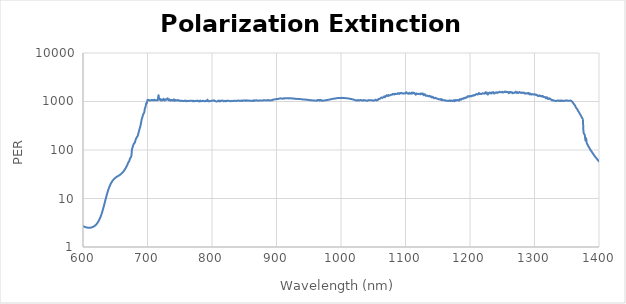
| Category | Series 0 |
|---|---|
| 2500.0 | 1.024 |
| 2499.0 | 1.025 |
| 2498.0 | 1.025 |
| 2497.0 | 1.025 |
| 2496.0 | 1.026 |
| 2495.0 | 1.027 |
| 2494.0 | 1.027 |
| 2493.0 | 1.027 |
| 2492.0 | 1.027 |
| 2491.0 | 1.028 |
| 2490.0 | 1.028 |
| 2489.0 | 1.028 |
| 2488.0 | 1.029 |
| 2487.0 | 1.029 |
| 2486.0 | 1.029 |
| 2485.0 | 1.029 |
| 2484.0 | 1.03 |
| 2483.0 | 1.03 |
| 2482.0 | 1.031 |
| 2481.0 | 1.031 |
| 2480.0 | 1.031 |
| 2479.0 | 1.032 |
| 2478.0 | 1.032 |
| 2477.0 | 1.032 |
| 2476.0 | 1.033 |
| 2475.0 | 1.033 |
| 2474.0 | 1.034 |
| 2473.0 | 1.034 |
| 2472.0 | 1.035 |
| 2471.0 | 1.035 |
| 2470.0 | 1.035 |
| 2469.0 | 1.035 |
| 2468.0 | 1.035 |
| 2467.0 | 1.036 |
| 2466.0 | 1.036 |
| 2465.0 | 1.037 |
| 2464.0 | 1.037 |
| 2463.0 | 1.037 |
| 2462.0 | 1.038 |
| 2461.0 | 1.038 |
| 2460.0 | 1.038 |
| 2459.0 | 1.039 |
| 2458.0 | 1.039 |
| 2457.0 | 1.04 |
| 2456.0 | 1.04 |
| 2455.0 | 1.041 |
| 2454.0 | 1.041 |
| 2453.0 | 1.041 |
| 2452.0 | 1.042 |
| 2451.0 | 1.042 |
| 2450.0 | 1.042 |
| 2449.0 | 1.043 |
| 2448.0 | 1.043 |
| 2447.0 | 1.043 |
| 2446.0 | 1.044 |
| 2445.0 | 1.044 |
| 2444.0 | 1.045 |
| 2443.0 | 1.045 |
| 2442.0 | 1.045 |
| 2441.0 | 1.046 |
| 2440.0 | 1.046 |
| 2439.0 | 1.046 |
| 2438.0 | 1.047 |
| 2437.0 | 1.047 |
| 2436.0 | 1.048 |
| 2435.0 | 1.048 |
| 2434.0 | 1.048 |
| 2433.0 | 1.048 |
| 2432.0 | 1.049 |
| 2431.0 | 1.049 |
| 2430.0 | 1.049 |
| 2429.0 | 1.049 |
| 2428.0 | 1.05 |
| 2427.0 | 1.05 |
| 2426.0 | 1.051 |
| 2425.0 | 1.051 |
| 2424.0 | 1.051 |
| 2423.0 | 1.051 |
| 2422.0 | 1.051 |
| 2421.0 | 1.052 |
| 2420.0 | 1.053 |
| 2419.0 | 1.052 |
| 2418.0 | 1.053 |
| 2417.0 | 1.053 |
| 2416.0 | 1.053 |
| 2415.0 | 1.053 |
| 2414.0 | 1.054 |
| 2413.0 | 1.054 |
| 2412.0 | 1.054 |
| 2411.0 | 1.054 |
| 2410.0 | 1.054 |
| 2409.0 | 1.055 |
| 2408.0 | 1.055 |
| 2407.0 | 1.055 |
| 2406.0 | 1.056 |
| 2405.0 | 1.055 |
| 2404.0 | 1.056 |
| 2403.0 | 1.056 |
| 2402.0 | 1.056 |
| 2401.0 | 1.056 |
| 2400.0 | 1.057 |
| 2399.0 | 1.057 |
| 2398.0 | 1.057 |
| 2397.0 | 1.058 |
| 2396.0 | 1.058 |
| 2395.0 | 1.057 |
| 2394.0 | 1.058 |
| 2393.0 | 1.057 |
| 2392.0 | 1.058 |
| 2391.0 | 1.058 |
| 2390.0 | 1.058 |
| 2389.0 | 1.058 |
| 2388.0 | 1.058 |
| 2387.0 | 1.058 |
| 2386.0 | 1.059 |
| 2385.0 | 1.059 |
| 2384.0 | 1.06 |
| 2383.0 | 1.059 |
| 2382.0 | 1.059 |
| 2381.0 | 1.059 |
| 2380.0 | 1.059 |
| 2379.0 | 1.06 |
| 2378.0 | 1.059 |
| 2377.0 | 1.06 |
| 2376.0 | 1.059 |
| 2375.0 | 1.059 |
| 2374.0 | 1.059 |
| 2373.0 | 1.06 |
| 2372.0 | 1.059 |
| 2371.0 | 1.06 |
| 2370.0 | 1.059 |
| 2369.0 | 1.06 |
| 2368.0 | 1.06 |
| 2367.0 | 1.06 |
| 2366.0 | 1.059 |
| 2365.0 | 1.06 |
| 2364.0 | 1.06 |
| 2363.0 | 1.06 |
| 2362.0 | 1.06 |
| 2361.0 | 1.06 |
| 2360.0 | 1.06 |
| 2359.0 | 1.06 |
| 2358.0 | 1.06 |
| 2357.0 | 1.06 |
| 2356.0 | 1.06 |
| 2355.0 | 1.059 |
| 2354.0 | 1.06 |
| 2353.0 | 1.059 |
| 2352.0 | 1.06 |
| 2351.0 | 1.06 |
| 2350.0 | 1.059 |
| 2349.0 | 1.06 |
| 2348.0 | 1.059 |
| 2347.0 | 1.059 |
| 2346.0 | 1.059 |
| 2345.0 | 1.059 |
| 2344.0 | 1.059 |
| 2343.0 | 1.06 |
| 2342.0 | 1.059 |
| 2341.0 | 1.059 |
| 2340.0 | 1.059 |
| 2339.0 | 1.059 |
| 2338.0 | 1.059 |
| 2337.0 | 1.059 |
| 2336.0 | 1.059 |
| 2335.0 | 1.059 |
| 2334.0 | 1.059 |
| 2333.0 | 1.059 |
| 2332.0 | 1.059 |
| 2331.0 | 1.059 |
| 2330.0 | 1.058 |
| 2329.0 | 1.059 |
| 2328.0 | 1.058 |
| 2327.0 | 1.058 |
| 2326.0 | 1.058 |
| 2325.0 | 1.058 |
| 2324.0 | 1.058 |
| 2323.0 | 1.058 |
| 2322.0 | 1.058 |
| 2321.0 | 1.058 |
| 2320.0 | 1.058 |
| 2319.0 | 1.058 |
| 2318.0 | 1.057 |
| 2317.0 | 1.058 |
| 2316.0 | 1.058 |
| 2315.0 | 1.058 |
| 2314.0 | 1.058 |
| 2313.0 | 1.058 |
| 2312.0 | 1.058 |
| 2311.0 | 1.058 |
| 2310.0 | 1.058 |
| 2309.0 | 1.058 |
| 2308.0 | 1.058 |
| 2307.0 | 1.058 |
| 2306.0 | 1.058 |
| 2305.0 | 1.058 |
| 2304.0 | 1.058 |
| 2303.0 | 1.058 |
| 2302.0 | 1.058 |
| 2301.0 | 1.058 |
| 2300.0 | 1.058 |
| 2299.0 | 1.058 |
| 2298.0 | 1.058 |
| 2297.0 | 1.058 |
| 2296.0 | 1.057 |
| 2295.0 | 1.057 |
| 2294.0 | 1.057 |
| 2293.0 | 1.057 |
| 2292.0 | 1.057 |
| 2291.0 | 1.057 |
| 2290.0 | 1.056 |
| 2289.0 | 1.057 |
| 2288.0 | 1.056 |
| 2287.0 | 1.056 |
| 2286.0 | 1.056 |
| 2285.0 | 1.056 |
| 2284.0 | 1.055 |
| 2283.0 | 1.055 |
| 2282.0 | 1.055 |
| 2281.0 | 1.055 |
| 2280.0 | 1.055 |
| 2279.0 | 1.055 |
| 2278.0 | 1.055 |
| 2277.0 | 1.055 |
| 2276.0 | 1.056 |
| 2275.0 | 1.056 |
| 2274.0 | 1.056 |
| 2273.0 | 1.057 |
| 2272.0 | 1.057 |
| 2271.0 | 1.058 |
| 2270.0 | 1.058 |
| 2269.0 | 1.059 |
| 2268.0 | 1.059 |
| 2267.0 | 1.06 |
| 2266.0 | 1.061 |
| 2265.0 | 1.061 |
| 2264.0 | 1.062 |
| 2263.0 | 1.062 |
| 2262.0 | 1.063 |
| 2261.0 | 1.064 |
| 2260.0 | 1.064 |
| 2259.0 | 1.065 |
| 2258.0 | 1.065 |
| 2257.0 | 1.065 |
| 2256.0 | 1.066 |
| 2255.0 | 1.067 |
| 2254.0 | 1.067 |
| 2253.0 | 1.068 |
| 2252.0 | 1.068 |
| 2251.0 | 1.069 |
| 2250.0 | 1.069 |
| 2249.0 | 1.07 |
| 2248.0 | 1.07 |
| 2247.0 | 1.071 |
| 2246.0 | 1.071 |
| 2245.0 | 1.071 |
| 2244.0 | 1.072 |
| 2243.0 | 1.072 |
| 2242.0 | 1.073 |
| 2241.0 | 1.073 |
| 2240.0 | 1.074 |
| 2239.0 | 1.074 |
| 2238.0 | 1.075 |
| 2237.0 | 1.075 |
| 2236.0 | 1.076 |
| 2235.0 | 1.076 |
| 2234.0 | 1.077 |
| 2233.0 | 1.078 |
| 2232.0 | 1.078 |
| 2231.0 | 1.079 |
| 2230.0 | 1.08 |
| 2229.0 | 1.081 |
| 2228.0 | 1.082 |
| 2227.0 | 1.082 |
| 2226.0 | 1.083 |
| 2225.0 | 1.084 |
| 2224.0 | 1.085 |
| 2223.0 | 1.086 |
| 2222.0 | 1.087 |
| 2221.0 | 1.088 |
| 2220.0 | 1.089 |
| 2219.0 | 1.09 |
| 2218.0 | 1.091 |
| 2217.0 | 1.092 |
| 2216.0 | 1.093 |
| 2215.0 | 1.094 |
| 2214.0 | 1.095 |
| 2213.0 | 1.096 |
| 2212.0 | 1.097 |
| 2211.0 | 1.098 |
| 2210.0 | 1.1 |
| 2209.0 | 1.101 |
| 2208.0 | 1.102 |
| 2207.0 | 1.103 |
| 2206.0 | 1.104 |
| 2205.0 | 1.105 |
| 2204.0 | 1.107 |
| 2203.0 | 1.108 |
| 2202.0 | 1.11 |
| 2201.0 | 1.111 |
| 2200.0 | 1.112 |
| 2199.0 | 1.114 |
| 2198.0 | 1.115 |
| 2197.0 | 1.116 |
| 2196.0 | 1.118 |
| 2195.0 | 1.12 |
| 2194.0 | 1.121 |
| 2193.0 | 1.122 |
| 2192.0 | 1.124 |
| 2191.0 | 1.126 |
| 2190.0 | 1.127 |
| 2189.0 | 1.129 |
| 2188.0 | 1.131 |
| 2187.0 | 1.132 |
| 2186.0 | 1.134 |
| 2185.0 | 1.136 |
| 2184.0 | 1.138 |
| 2183.0 | 1.14 |
| 2182.0 | 1.142 |
| 2181.0 | 1.144 |
| 2180.0 | 1.146 |
| 2179.0 | 1.148 |
| 2178.0 | 1.151 |
| 2177.0 | 1.153 |
| 2176.0 | 1.156 |
| 2175.0 | 1.158 |
| 2174.0 | 1.16 |
| 2173.0 | 1.162 |
| 2172.0 | 1.165 |
| 2171.0 | 1.167 |
| 2170.0 | 1.17 |
| 2169.0 | 1.172 |
| 2168.0 | 1.175 |
| 2167.0 | 1.177 |
| 2166.0 | 1.18 |
| 2165.0 | 1.182 |
| 2164.0 | 1.185 |
| 2163.0 | 1.187 |
| 2162.0 | 1.19 |
| 2161.0 | 1.193 |
| 2160.0 | 1.195 |
| 2159.0 | 1.198 |
| 2158.0 | 1.201 |
| 2157.0 | 1.203 |
| 2156.0 | 1.206 |
| 2155.0 | 1.209 |
| 2154.0 | 1.212 |
| 2153.0 | 1.215 |
| 2152.0 | 1.218 |
| 2151.0 | 1.22 |
| 2150.0 | 1.222 |
| 2149.0 | 1.226 |
| 2148.0 | 1.229 |
| 2147.0 | 1.231 |
| 2146.0 | 1.234 |
| 2145.0 | 1.238 |
| 2144.0 | 1.24 |
| 2143.0 | 1.244 |
| 2142.0 | 1.247 |
| 2141.0 | 1.249 |
| 2140.0 | 1.252 |
| 2139.0 | 1.255 |
| 2138.0 | 1.258 |
| 2137.0 | 1.261 |
| 2136.0 | 1.264 |
| 2135.0 | 1.267 |
| 2134.0 | 1.27 |
| 2133.0 | 1.274 |
| 2132.0 | 1.276 |
| 2131.0 | 1.278 |
| 2130.0 | 1.283 |
| 2129.0 | 1.286 |
| 2128.0 | 1.289 |
| 2127.0 | 1.291 |
| 2126.0 | 1.295 |
| 2125.0 | 1.298 |
| 2124.0 | 1.299 |
| 2123.0 | 1.303 |
| 2122.0 | 1.307 |
| 2121.0 | 1.309 |
| 2120.0 | 1.313 |
| 2119.0 | 1.316 |
| 2118.0 | 1.318 |
| 2117.0 | 1.322 |
| 2116.0 | 1.325 |
| 2115.0 | 1.327 |
| 2114.0 | 1.33 |
| 2113.0 | 1.333 |
| 2112.0 | 1.336 |
| 2111.0 | 1.339 |
| 2110.0 | 1.342 |
| 2109.0 | 1.345 |
| 2108.0 | 1.347 |
| 2107.0 | 1.35 |
| 2106.0 | 1.352 |
| 2105.0 | 1.356 |
| 2104.0 | 1.359 |
| 2103.0 | 1.36 |
| 2102.0 | 1.364 |
| 2101.0 | 1.367 |
| 2100.0 | 1.368 |
| 2099.0 | 1.371 |
| 2098.0 | 1.374 |
| 2097.0 | 1.377 |
| 2096.0 | 1.378 |
| 2095.0 | 1.38 |
| 2094.0 | 1.383 |
| 2093.0 | 1.384 |
| 2092.0 | 1.387 |
| 2091.0 | 1.39 |
| 2090.0 | 1.391 |
| 2089.0 | 1.393 |
| 2088.0 | 1.396 |
| 2087.0 | 1.398 |
| 2086.0 | 1.399 |
| 2085.0 | 1.402 |
| 2084.0 | 1.402 |
| 2083.0 | 1.405 |
| 2082.0 | 1.407 |
| 2081.0 | 1.408 |
| 2080.0 | 1.408 |
| 2079.0 | 1.412 |
| 2078.0 | 1.413 |
| 2077.0 | 1.413 |
| 2076.0 | 1.415 |
| 2075.0 | 1.416 |
| 2074.0 | 1.417 |
| 2073.0 | 1.418 |
| 2072.0 | 1.42 |
| 2071.0 | 1.421 |
| 2070.0 | 1.421 |
| 2069.0 | 1.422 |
| 2068.0 | 1.422 |
| 2067.0 | 1.423 |
| 2066.0 | 1.424 |
| 2065.0 | 1.424 |
| 2064.0 | 1.425 |
| 2063.0 | 1.425 |
| 2062.0 | 1.424 |
| 2061.0 | 1.426 |
| 2060.0 | 1.425 |
| 2059.0 | 1.424 |
| 2058.0 | 1.425 |
| 2057.0 | 1.424 |
| 2056.0 | 1.424 |
| 2055.0 | 1.424 |
| 2054.0 | 1.423 |
| 2053.0 | 1.423 |
| 2052.0 | 1.423 |
| 2051.0 | 1.422 |
| 2050.0 | 1.421 |
| 2049.0 | 1.42 |
| 2048.0 | 1.419 |
| 2047.0 | 1.418 |
| 2046.0 | 1.417 |
| 2045.0 | 1.416 |
| 2044.0 | 1.414 |
| 2043.0 | 1.413 |
| 2042.0 | 1.412 |
| 2041.0 | 1.41 |
| 2040.0 | 1.409 |
| 2039.0 | 1.407 |
| 2038.0 | 1.406 |
| 2037.0 | 1.403 |
| 2036.0 | 1.401 |
| 2035.0 | 1.399 |
| 2034.0 | 1.398 |
| 2033.0 | 1.394 |
| 2032.0 | 1.392 |
| 2031.0 | 1.39 |
| 2030.0 | 1.388 |
| 2029.0 | 1.386 |
| 2028.0 | 1.383 |
| 2027.0 | 1.381 |
| 2026.0 | 1.377 |
| 2025.0 | 1.375 |
| 2024.0 | 1.372 |
| 2023.0 | 1.369 |
| 2022.0 | 1.366 |
| 2021.0 | 1.363 |
| 2020.0 | 1.36 |
| 2019.0 | 1.357 |
| 2018.0 | 1.353 |
| 2017.0 | 1.35 |
| 2016.0 | 1.347 |
| 2015.0 | 1.344 |
| 2014.0 | 1.341 |
| 2013.0 | 1.335 |
| 2012.0 | 1.334 |
| 2011.0 | 1.329 |
| 2010.0 | 1.326 |
| 2009.0 | 1.322 |
| 2008.0 | 1.317 |
| 2007.0 | 1.314 |
| 2006.0 | 1.311 |
| 2005.0 | 1.306 |
| 2004.0 | 1.303 |
| 2003.0 | 1.298 |
| 2002.0 | 1.294 |
| 2001.0 | 1.291 |
| 2000.0 | 1.286 |
| 1999.0 | 1.271 |
| 1998.0 | 1.267 |
| 1997.0 | 1.262 |
| 1996.0 | 1.258 |
| 1995.0 | 1.254 |
| 1994.0 | 1.249 |
| 1993.0 | 1.245 |
| 1992.0 | 1.24 |
| 1991.0 | 1.236 |
| 1990.0 | 1.232 |
| 1989.0 | 1.227 |
| 1988.0 | 1.223 |
| 1987.0 | 1.218 |
| 1986.0 | 1.214 |
| 1985.0 | 1.21 |
| 1984.0 | 1.205 |
| 1983.0 | 1.201 |
| 1982.0 | 1.196 |
| 1981.0 | 1.192 |
| 1980.0 | 1.187 |
| 1979.0 | 1.183 |
| 1978.0 | 1.178 |
| 1977.0 | 1.175 |
| 1976.0 | 1.169 |
| 1975.0 | 1.165 |
| 1974.0 | 1.162 |
| 1973.0 | 1.156 |
| 1972.0 | 1.153 |
| 1971.0 | 1.149 |
| 1970.0 | 1.145 |
| 1969.0 | 1.141 |
| 1968.0 | 1.137 |
| 1967.0 | 1.133 |
| 1966.0 | 1.129 |
| 1965.0 | 1.125 |
| 1964.0 | 1.121 |
| 1963.0 | 1.117 |
| 1962.0 | 1.114 |
| 1961.0 | 1.11 |
| 1960.0 | 1.107 |
| 1959.0 | 1.103 |
| 1958.0 | 1.1 |
| 1957.0 | 1.097 |
| 1956.0 | 1.093 |
| 1955.0 | 1.09 |
| 1954.0 | 1.087 |
| 1953.0 | 1.083 |
| 1952.0 | 1.082 |
| 1951.0 | 1.078 |
| 1950.0 | 1.075 |
| 1949.0 | 1.073 |
| 1948.0 | 1.069 |
| 1947.0 | 1.067 |
| 1946.0 | 1.065 |
| 1945.0 | 1.063 |
| 1944.0 | 1.06 |
| 1943.0 | 1.058 |
| 1942.0 | 1.056 |
| 1941.0 | 1.054 |
| 1940.0 | 1.052 |
| 1939.0 | 1.051 |
| 1938.0 | 1.049 |
| 1937.0 | 1.048 |
| 1936.0 | 1.046 |
| 1935.0 | 1.045 |
| 1934.0 | 1.044 |
| 1933.0 | 1.043 |
| 1932.0 | 1.042 |
| 1931.0 | 1.041 |
| 1930.0 | 1.04 |
| 1929.0 | 1.04 |
| 1928.0 | 1.039 |
| 1927.0 | 1.039 |
| 1926.0 | 1.038 |
| 1925.0 | 1.038 |
| 1924.0 | 1.038 |
| 1923.0 | 1.037 |
| 1922.0 | 1.038 |
| 1921.0 | 1.039 |
| 1920.0 | 1.039 |
| 1919.0 | 1.039 |
| 1918.0 | 1.04 |
| 1917.0 | 1.04 |
| 1916.0 | 1.041 |
| 1915.0 | 1.042 |
| 1914.0 | 1.043 |
| 1913.0 | 1.044 |
| 1912.0 | 1.045 |
| 1911.0 | 1.046 |
| 1910.0 | 1.051 |
| 1909.0 | 1.049 |
| 1908.0 | 1.051 |
| 1907.0 | 1.052 |
| 1906.0 | 1.054 |
| 1905.0 | 1.056 |
| 1904.0 | 1.058 |
| 1903.0 | 1.061 |
| 1902.0 | 1.063 |
| 1901.0 | 1.064 |
| 1900.0 | 1.068 |
| 1899.0 | 1.07 |
| 1898.0 | 1.073 |
| 1897.0 | 1.076 |
| 1896.0 | 1.078 |
| 1895.0 | 1.081 |
| 1894.0 | 1.084 |
| 1893.0 | 1.087 |
| 1892.0 | 1.09 |
| 1891.0 | 1.093 |
| 1890.0 | 1.096 |
| 1889.0 | 1.099 |
| 1888.0 | 1.102 |
| 1887.0 | 1.106 |
| 1886.0 | 1.109 |
| 1885.0 | 1.113 |
| 1884.0 | 1.116 |
| 1883.0 | 1.12 |
| 1882.0 | 1.123 |
| 1881.0 | 1.127 |
| 1880.0 | 1.131 |
| 1879.0 | 1.134 |
| 1878.0 | 1.138 |
| 1877.0 | 1.142 |
| 1876.0 | 1.146 |
| 1875.0 | 1.15 |
| 1874.0 | 1.155 |
| 1873.0 | 1.159 |
| 1872.0 | 1.164 |
| 1871.0 | 1.17 |
| 1870.0 | 1.174 |
| 1869.0 | 1.18 |
| 1868.0 | 1.185 |
| 1867.0 | 1.189 |
| 1866.0 | 1.194 |
| 1865.0 | 1.199 |
| 1864.0 | 1.204 |
| 1863.0 | 1.208 |
| 1862.0 | 1.213 |
| 1861.0 | 1.217 |
| 1860.0 | 1.222 |
| 1859.0 | 1.227 |
| 1858.0 | 1.232 |
| 1857.0 | 1.237 |
| 1856.0 | 1.242 |
| 1855.0 | 1.247 |
| 1854.0 | 1.252 |
| 1853.0 | 1.257 |
| 1852.0 | 1.263 |
| 1851.0 | 1.267 |
| 1850.0 | 1.273 |
| 1849.0 | 1.278 |
| 1848.0 | 1.285 |
| 1847.0 | 1.288 |
| 1846.0 | 1.293 |
| 1845.0 | 1.298 |
| 1844.0 | 1.303 |
| 1843.0 | 1.308 |
| 1842.0 | 1.313 |
| 1841.0 | 1.318 |
| 1840.0 | 1.323 |
| 1839.0 | 1.328 |
| 1838.0 | 1.333 |
| 1837.0 | 1.338 |
| 1836.0 | 1.343 |
| 1835.0 | 1.346 |
| 1834.0 | 1.353 |
| 1833.0 | 1.357 |
| 1832.0 | 1.361 |
| 1831.0 | 1.366 |
| 1830.0 | 1.37 |
| 1829.0 | 1.374 |
| 1828.0 | 1.378 |
| 1827.0 | 1.382 |
| 1826.0 | 1.386 |
| 1825.0 | 1.39 |
| 1824.0 | 1.393 |
| 1823.0 | 1.397 |
| 1822.0 | 1.4 |
| 1821.0 | 1.403 |
| 1820.0 | 1.406 |
| 1819.0 | 1.409 |
| 1818.0 | 1.412 |
| 1817.0 | 1.415 |
| 1816.0 | 1.418 |
| 1815.0 | 1.42 |
| 1814.0 | 1.422 |
| 1813.0 | 1.424 |
| 1812.0 | 1.426 |
| 1811.0 | 1.428 |
| 1810.0 | 1.43 |
| 1809.0 | 1.431 |
| 1808.0 | 1.432 |
| 1807.0 | 1.433 |
| 1806.0 | 1.434 |
| 1805.0 | 1.435 |
| 1804.0 | 1.436 |
| 1803.0 | 1.436 |
| 1802.0 | 1.437 |
| 1801.0 | 1.437 |
| 1800.0 | 1.437 |
| 1799.0 | 1.436 |
| 1798.0 | 1.436 |
| 1797.0 | 1.436 |
| 1796.0 | 1.436 |
| 1795.0 | 1.435 |
| 1794.0 | 1.434 |
| 1793.0 | 1.434 |
| 1792.0 | 1.432 |
| 1791.0 | 1.432 |
| 1790.0 | 1.43 |
| 1789.0 | 1.429 |
| 1788.0 | 1.428 |
| 1787.0 | 1.426 |
| 1786.0 | 1.424 |
| 1785.0 | 1.423 |
| 1784.0 | 1.421 |
| 1783.0 | 1.419 |
| 1782.0 | 1.417 |
| 1781.0 | 1.415 |
| 1780.0 | 1.413 |
| 1779.0 | 1.411 |
| 1778.0 | 1.409 |
| 1777.0 | 1.407 |
| 1776.0 | 1.404 |
| 1775.0 | 1.402 |
| 1774.0 | 1.4 |
| 1773.0 | 1.397 |
| 1772.0 | 1.395 |
| 1771.0 | 1.393 |
| 1770.0 | 1.39 |
| 1769.0 | 1.388 |
| 1768.0 | 1.386 |
| 1767.0 | 1.384 |
| 1766.0 | 1.382 |
| 1765.0 | 1.38 |
| 1764.0 | 1.377 |
| 1763.0 | 1.375 |
| 1762.0 | 1.374 |
| 1761.0 | 1.372 |
| 1760.0 | 1.369 |
| 1759.0 | 1.368 |
| 1758.0 | 1.367 |
| 1757.0 | 1.366 |
| 1756.0 | 1.363 |
| 1755.0 | 1.362 |
| 1754.0 | 1.362 |
| 1753.0 | 1.361 |
| 1752.0 | 1.359 |
| 1751.0 | 1.359 |
| 1750.0 | 1.359 |
| 1749.0 | 1.358 |
| 1748.0 | 1.357 |
| 1747.0 | 1.358 |
| 1746.0 | 1.358 |
| 1745.0 | 1.357 |
| 1744.0 | 1.358 |
| 1743.0 | 1.359 |
| 1742.0 | 1.359 |
| 1741.0 | 1.36 |
| 1740.0 | 1.361 |
| 1739.0 | 1.363 |
| 1738.0 | 1.364 |
| 1737.0 | 1.366 |
| 1736.0 | 1.368 |
| 1735.0 | 1.37 |
| 1734.0 | 1.372 |
| 1733.0 | 1.376 |
| 1732.0 | 1.377 |
| 1731.0 | 1.38 |
| 1730.0 | 1.384 |
| 1729.0 | 1.388 |
| 1728.0 | 1.39 |
| 1727.0 | 1.394 |
| 1726.0 | 1.399 |
| 1725.0 | 1.404 |
| 1724.0 | 1.407 |
| 1723.0 | 1.413 |
| 1722.0 | 1.418 |
| 1721.0 | 1.423 |
| 1720.0 | 1.429 |
| 1719.0 | 1.436 |
| 1718.0 | 1.441 |
| 1717.0 | 1.448 |
| 1716.0 | 1.455 |
| 1715.0 | 1.462 |
| 1714.0 | 1.47 |
| 1713.0 | 1.477 |
| 1712.0 | 1.484 |
| 1711.0 | 1.494 |
| 1710.0 | 1.502 |
| 1709.0 | 1.511 |
| 1708.0 | 1.519 |
| 1707.0 | 1.53 |
| 1706.0 | 1.54 |
| 1705.0 | 1.548 |
| 1704.0 | 1.562 |
| 1703.0 | 1.572 |
| 1702.0 | 1.581 |
| 1701.0 | 1.594 |
| 1700.0 | 1.607 |
| 1699.0 | 1.617 |
| 1698.0 | 1.63 |
| 1697.0 | 1.644 |
| 1696.0 | 1.656 |
| 1695.0 | 1.669 |
| 1694.0 | 1.684 |
| 1693.0 | 1.696 |
| 1692.0 | 1.712 |
| 1691.0 | 1.726 |
| 1690.0 | 1.74 |
| 1689.0 | 1.756 |
| 1688.0 | 1.771 |
| 1687.0 | 1.787 |
| 1686.0 | 1.803 |
| 1685.0 | 1.819 |
| 1684.0 | 1.836 |
| 1683.0 | 1.852 |
| 1682.0 | 1.869 |
| 1681.0 | 1.886 |
| 1680.0 | 1.902 |
| 1679.0 | 1.92 |
| 1678.0 | 1.938 |
| 1677.0 | 1.954 |
| 1676.0 | 1.972 |
| 1675.0 | 1.991 |
| 1674.0 | 2.007 |
| 1673.0 | 2.025 |
| 1672.0 | 2.044 |
| 1671.0 | 2.06 |
| 1670.0 | 2.077 |
| 1669.0 | 2.096 |
| 1668.0 | 2.112 |
| 1667.0 | 2.129 |
| 1666.0 | 2.147 |
| 1665.0 | 2.163 |
| 1664.0 | 2.178 |
| 1663.0 | 2.197 |
| 1662.0 | 2.211 |
| 1661.0 | 2.227 |
| 1660.0 | 2.242 |
| 1659.0 | 2.258 |
| 1658.0 | 2.271 |
| 1657.0 | 2.286 |
| 1656.0 | 2.297 |
| 1655.0 | 2.314 |
| 1654.0 | 2.324 |
| 1653.0 | 2.337 |
| 1652.0 | 2.346 |
| 1651.0 | 2.36 |
| 1650.0 | 2.366 |
| 1649.0 | 2.379 |
| 1648.0 | 2.386 |
| 1647.0 | 2.395 |
| 1646.0 | 2.4 |
| 1645.0 | 2.409 |
| 1644.0 | 2.413 |
| 1643.0 | 2.417 |
| 1642.0 | 2.423 |
| 1641.0 | 2.424 |
| 1640.0 | 2.428 |
| 1639.0 | 2.43 |
| 1638.0 | 2.428 |
| 1637.0 | 2.43 |
| 1636.0 | 2.429 |
| 1635.0 | 2.427 |
| 1634.0 | 2.424 |
| 1633.0 | 2.421 |
| 1632.0 | 2.418 |
| 1631.0 | 2.412 |
| 1630.0 | 2.405 |
| 1629.0 | 2.403 |
| 1628.0 | 2.393 |
| 1627.0 | 2.386 |
| 1626.0 | 2.379 |
| 1625.0 | 2.369 |
| 1624.0 | 2.363 |
| 1623.0 | 2.353 |
| 1622.0 | 2.342 |
| 1621.0 | 2.334 |
| 1620.0 | 2.324 |
| 1619.0 | 2.313 |
| 1618.0 | 2.304 |
| 1617.0 | 2.293 |
| 1616.0 | 2.283 |
| 1615.0 | 2.272 |
| 1614.0 | 2.262 |
| 1613.0 | 2.254 |
| 1612.0 | 2.244 |
| 1611.0 | 2.235 |
| 1610.0 | 2.227 |
| 1609.0 | 2.219 |
| 1608.0 | 2.211 |
| 1607.0 | 2.204 |
| 1606.0 | 2.199 |
| 1605.0 | 2.194 |
| 1604.0 | 2.19 |
| 1603.0 | 2.183 |
| 1602.0 | 2.183 |
| 1601.0 | 2.181 |
| 1600.0 | 2.181 |
| 1599.0 | 2.179 |
| 1598.0 | 2.182 |
| 1597.0 | 2.185 |
| 1596.0 | 2.189 |
| 1595.0 | 2.194 |
| 1594.0 | 2.201 |
| 1593.0 | 2.207 |
| 1592.0 | 2.218 |
| 1591.0 | 2.226 |
| 1590.0 | 2.24 |
| 1589.0 | 2.251 |
| 1588.0 | 2.266 |
| 1587.0 | 2.281 |
| 1586.0 | 2.298 |
| 1585.0 | 2.316 |
| 1584.0 | 2.337 |
| 1583.0 | 2.36 |
| 1582.0 | 2.383 |
| 1581.0 | 2.408 |
| 1580.0 | 2.436 |
| 1579.0 | 2.464 |
| 1578.0 | 2.496 |
| 1577.0 | 2.529 |
| 1576.0 | 2.563 |
| 1575.0 | 2.601 |
| 1574.0 | 2.64 |
| 1573.0 | 2.682 |
| 1572.0 | 2.728 |
| 1571.0 | 2.775 |
| 1570.0 | 2.824 |
| 1569.0 | 2.877 |
| 1568.0 | 2.934 |
| 1567.0 | 2.99 |
| 1566.0 | 3.057 |
| 1565.0 | 3.122 |
| 1564.0 | 3.192 |
| 1563.0 | 3.265 |
| 1562.0 | 3.346 |
| 1561.0 | 3.427 |
| 1560.0 | 3.513 |
| 1559.0 | 3.609 |
| 1558.0 | 3.708 |
| 1557.0 | 3.81 |
| 1556.0 | 3.92 |
| 1555.0 | 4.037 |
| 1554.0 | 4.156 |
| 1553.0 | 4.289 |
| 1552.0 | 4.429 |
| 1551.0 | 4.57 |
| 1550.0 | 4.724 |
| 1549.0 | 4.884 |
| 1548.0 | 5.051 |
| 1547.0 | 5.231 |
| 1546.0 | 5.424 |
| 1545.0 | 5.621 |
| 1544.0 | 5.839 |
| 1543.0 | 6.044 |
| 1542.0 | 6.272 |
| 1541.0 | 6.511 |
| 1540.0 | 6.771 |
| 1539.0 | 7.036 |
| 1538.0 | 7.302 |
| 1537.0 | 7.581 |
| 1536.0 | 7.9 |
| 1535.0 | 8.193 |
| 1534.0 | 8.518 |
| 1533.0 | 8.855 |
| 1532.0 | 9.189 |
| 1531.0 | 9.566 |
| 1530.0 | 9.932 |
| 1529.0 | 10.305 |
| 1528.0 | 10.7 |
| 1527.0 | 11.12 |
| 1526.0 | 11.531 |
| 1525.0 | 11.957 |
| 1524.0 | 12.401 |
| 1523.0 | 12.863 |
| 1522.0 | 13.319 |
| 1521.0 | 13.801 |
| 1520.0 | 14.281 |
| 1519.0 | 14.796 |
| 1518.0 | 15.304 |
| 1517.0 | 15.816 |
| 1516.0 | 16.327 |
| 1515.0 | 16.88 |
| 1514.0 | 17.459 |
| 1513.0 | 17.988 |
| 1512.0 | 18.566 |
| 1511.0 | 19.14 |
| 1510.0 | 19.704 |
| 1509.0 | 20.294 |
| 1508.0 | 20.924 |
| 1507.0 | 21.521 |
| 1506.0 | 22.12 |
| 1505.0 | 22.724 |
| 1504.0 | 23.343 |
| 1503.0 | 23.968 |
| 1502.0 | 24.603 |
| 1501.0 | 25.232 |
| 1500.0 | 25.853 |
| 1499.0 | 26.503 |
| 1498.0 | 27.131 |
| 1497.0 | 27.718 |
| 1496.0 | 28.381 |
| 1495.0 | 29.04 |
| 1494.0 | 29.637 |
| 1493.0 | 30.292 |
| 1492.0 | 30.901 |
| 1491.0 | 31.5 |
| 1490.0 | 32.046 |
| 1489.0 | 32.712 |
| 1488.0 | 33.276 |
| 1487.0 | 33.835 |
| 1486.0 | 34.393 |
| 1485.0 | 34.929 |
| 1484.0 | 35.439 |
| 1483.0 | 36.028 |
| 1482.0 | 36.483 |
| 1481.0 | 36.984 |
| 1480.0 | 37.491 |
| 1479.0 | 37.873 |
| 1478.0 | 38.377 |
| 1477.0 | 38.761 |
| 1476.0 | 39.211 |
| 1475.0 | 39.471 |
| 1474.0 | 39.817 |
| 1473.0 | 40.167 |
| 1472.0 | 40.433 |
| 1471.0 | 40.617 |
| 1470.0 | 40.951 |
| 1469.0 | 41.075 |
| 1468.0 | 41.281 |
| 1467.0 | 41.425 |
| 1466.0 | 41.624 |
| 1465.0 | 41.569 |
| 1464.0 | 41.758 |
| 1463.0 | 41.747 |
| 1462.0 | 41.674 |
| 1461.0 | 41.611 |
| 1460.0 | 41.606 |
| 1459.0 | 41.502 |
| 1458.0 | 41.371 |
| 1457.0 | 41.241 |
| 1456.0 | 41.064 |
| 1455.0 | 40.833 |
| 1454.0 | 40.649 |
| 1453.0 | 40.502 |
| 1452.0 | 40.238 |
| 1451.0 | 39.977 |
| 1450.0 | 39.714 |
| 1449.0 | 39.395 |
| 1448.0 | 39.169 |
| 1447.0 | 38.813 |
| 1446.0 | 38.553 |
| 1445.0 | 38.277 |
| 1444.0 | 37.966 |
| 1443.0 | 37.779 |
| 1442.0 | 37.52 |
| 1441.0 | 37.237 |
| 1440.0 | 37.071 |
| 1439.0 | 36.826 |
| 1438.0 | 36.787 |
| 1437.0 | 36.626 |
| 1436.0 | 36.506 |
| 1435.0 | 36.354 |
| 1434.0 | 36.339 |
| 1433.0 | 36.3 |
| 1432.0 | 36.373 |
| 1431.0 | 36.345 |
| 1430.0 | 36.431 |
| 1429.0 | 36.541 |
| 1428.0 | 36.703 |
| 1427.0 | 36.858 |
| 1426.0 | 37.066 |
| 1425.0 | 37.221 |
| 1424.0 | 37.512 |
| 1423.0 | 37.676 |
| 1422.0 | 38.184 |
| 1421.0 | 38.587 |
| 1420.0 | 39.023 |
| 1419.0 | 39.444 |
| 1418.0 | 39.939 |
| 1417.0 | 40.468 |
| 1416.0 | 41.078 |
| 1415.0 | 41.655 |
| 1414.0 | 42.39 |
| 1413.0 | 43.092 |
| 1412.0 | 43.827 |
| 1411.0 | 44.67 |
| 1410.0 | 45.551 |
| 1409.0 | 46.527 |
| 1408.0 | 47.55 |
| 1407.0 | 48.799 |
| 1406.0 | 49.882 |
| 1405.0 | 51.09 |
| 1404.0 | 52.368 |
| 1403.0 | 53.771 |
| 1402.0 | 55.339 |
| 1401.0 | 57.049 |
| 1400.0 | 58.723 |
| 1399.0 | 60.664 |
| 1398.0 | 62.661 |
| 1397.0 | 64.88 |
| 1396.0 | 67.532 |
| 1395.0 | 70.01 |
| 1394.0 | 73.048 |
| 1393.0 | 75.992 |
| 1392.0 | 79.405 |
| 1391.0 | 83.198 |
| 1390.0 | 86.507 |
| 1389.0 | 90.744 |
| 1388.0 | 94.875 |
| 1387.0 | 99.618 |
| 1386.0 | 104.889 |
| 1385.0 | 110.366 |
| 1384.0 | 116.597 |
| 1383.0 | 123.641 |
| 1382.0 | 131.174 |
| 1381.0 | 139.294 |
| 1380.0 | 174.838 |
| 1379.0 | 157.56 |
| 1378.0 | 201.045 |
| 1377.0 | 216.371 |
| 1376.0 | 231.198 |
| 1375.0 | 429.305 |
| 1374.0 | 453.867 |
| 1373.0 | 479.461 |
| 1372.0 | 508.215 |
| 1371.0 | 537.178 |
| 1370.0 | 567.382 |
| 1369.0 | 599.987 |
| 1368.0 | 627.661 |
| 1367.0 | 662.133 |
| 1366.0 | 699.349 |
| 1365.0 | 729.151 |
| 1364.0 | 762.886 |
| 1363.0 | 813.802 |
| 1362.0 | 856.886 |
| 1361.0 | 888.825 |
| 1360.0 | 927.166 |
| 1359.0 | 964.625 |
| 1358.0 | 1003.438 |
| 1357.0 | 1026.747 |
| 1356.0 | 1046.138 |
| 1355.0 | 1030.937 |
| 1354.0 | 1034.794 |
| 1353.0 | 1036.106 |
| 1352.0 | 1039.177 |
| 1351.0 | 1043.803 |
| 1350.0 | 1053.078 |
| 1349.0 | 1040.169 |
| 1348.0 | 1044.754 |
| 1347.0 | 1035.648 |
| 1346.0 | 1040.296 |
| 1345.0 | 1019.346 |
| 1344.0 | 1026.722 |
| 1343.0 | 1035.032 |
| 1342.0 | 1049.792 |
| 1341.0 | 1020.607 |
| 1340.0 | 1048.704 |
| 1339.0 | 1036.408 |
| 1338.0 | 1027.41 |
| 1337.0 | 1045.072 |
| 1336.0 | 1053.654 |
| 1335.0 | 1041.558 |
| 1334.0 | 1022.088 |
| 1333.0 | 1030.123 |
| 1332.0 | 1030.563 |
| 1331.0 | 1043.128 |
| 1330.0 | 1048.962 |
| 1329.0 | 1041.581 |
| 1328.0 | 1072.54 |
| 1327.0 | 1056.614 |
| 1326.0 | 1078.789 |
| 1325.0 | 1121.068 |
| 1324.0 | 1124.456 |
| 1323.0 | 1167.331 |
| 1322.0 | 1135.667 |
| 1321.0 | 1126.751 |
| 1320.0 | 1185.677 |
| 1319.0 | 1224.738 |
| 1318.0 | 1157.295 |
| 1317.0 | 1227.009 |
| 1316.0 | 1220.571 |
| 1315.0 | 1240.252 |
| 1314.0 | 1236.432 |
| 1313.0 | 1294.109 |
| 1312.0 | 1304.293 |
| 1311.0 | 1264.449 |
| 1310.0 | 1300.247 |
| 1309.0 | 1292.453 |
| 1308.0 | 1339.587 |
| 1307.0 | 1314.247 |
| 1306.0 | 1292.719 |
| 1305.0 | 1305.323 |
| 1304.0 | 1355.302 |
| 1303.0 | 1359.491 |
| 1302.0 | 1394.909 |
| 1301.0 | 1367.572 |
| 1300.0 | 1411.221 |
| 1299.0 | 1409.957 |
| 1298.0 | 1389.222 |
| 1297.0 | 1412.969 |
| 1296.0 | 1416.268 |
| 1295.0 | 1387.257 |
| 1294.0 | 1427.686 |
| 1293.0 | 1463.888 |
| 1292.0 | 1398.309 |
| 1291.0 | 1482.457 |
| 1290.0 | 1494.017 |
| 1289.0 | 1456.068 |
| 1288.0 | 1482.362 |
| 1287.0 | 1486.248 |
| 1286.0 | 1453.077 |
| 1285.0 | 1457.759 |
| 1284.0 | 1512.488 |
| 1283.0 | 1509.596 |
| 1282.0 | 1534.076 |
| 1281.0 | 1491.822 |
| 1280.0 | 1523.892 |
| 1279.0 | 1517.245 |
| 1278.0 | 1518.097 |
| 1277.0 | 1567.226 |
| 1276.0 | 1552.355 |
| 1275.0 | 1502.278 |
| 1274.0 | 1507.008 |
| 1273.0 | 1565.207 |
| 1272.0 | 1502.27 |
| 1271.0 | 1593.827 |
| 1270.0 | 1563.43 |
| 1269.0 | 1517.715 |
| 1268.0 | 1509.749 |
| 1267.0 | 1498.833 |
| 1266.0 | 1480.769 |
| 1265.0 | 1556.941 |
| 1264.0 | 1530.678 |
| 1263.0 | 1562.313 |
| 1262.0 | 1577.836 |
| 1261.0 | 1506.604 |
| 1260.0 | 1487.528 |
| 1259.0 | 1559.523 |
| 1258.0 | 1569.084 |
| 1257.0 | 1584.593 |
| 1256.0 | 1571.441 |
| 1255.0 | 1565.111 |
| 1254.0 | 1607.338 |
| 1253.0 | 1562.585 |
| 1252.0 | 1556.706 |
| 1251.0 | 1532.624 |
| 1250.0 | 1583.227 |
| 1249.0 | 1555.615 |
| 1248.0 | 1556.73 |
| 1247.0 | 1562.047 |
| 1246.0 | 1587.089 |
| 1245.0 | 1561.447 |
| 1244.0 | 1540.434 |
| 1243.0 | 1504.316 |
| 1242.0 | 1551.93 |
| 1241.0 | 1514.658 |
| 1240.0 | 1534.603 |
| 1239.0 | 1516.631 |
| 1238.0 | 1457.519 |
| 1237.0 | 1473.181 |
| 1236.0 | 1563.168 |
| 1235.0 | 1513.691 |
| 1234.0 | 1539.832 |
| 1233.0 | 1454.161 |
| 1232.0 | 1499.068 |
| 1231.0 | 1530.131 |
| 1230.0 | 1502.388 |
| 1229.0 | 1499.995 |
| 1228.0 | 1402.97 |
| 1227.0 | 1416.024 |
| 1226.0 | 1530.51 |
| 1225.0 | 1460.416 |
| 1224.0 | 1552.003 |
| 1223.0 | 1485.828 |
| 1222.0 | 1453.307 |
| 1221.0 | 1463.521 |
| 1220.0 | 1484.089 |
| 1219.0 | 1459.758 |
| 1218.0 | 1428.762 |
| 1217.0 | 1428.593 |
| 1216.0 | 1448.231 |
| 1215.0 | 1424.503 |
| 1214.0 | 1495.961 |
| 1213.0 | 1456.08 |
| 1212.0 | 1395.879 |
| 1211.0 | 1407.624 |
| 1210.0 | 1429.196 |
| 1209.0 | 1393.479 |
| 1208.0 | 1356.526 |
| 1207.0 | 1360.066 |
| 1206.0 | 1317.528 |
| 1205.0 | 1348.685 |
| 1204.0 | 1311.91 |
| 1203.0 | 1309.747 |
| 1202.0 | 1279.178 |
| 1201.0 | 1302.616 |
| 1200.0 | 1301.022 |
| 1199.0 | 1262.077 |
| 1198.0 | 1263.207 |
| 1197.0 | 1295.334 |
| 1196.0 | 1263.794 |
| 1195.0 | 1216.539 |
| 1194.0 | 1189.052 |
| 1193.0 | 1213.078 |
| 1192.0 | 1170.504 |
| 1191.0 | 1186.503 |
| 1190.0 | 1144.025 |
| 1189.0 | 1137.303 |
| 1188.0 | 1150.558 |
| 1187.0 | 1126.713 |
| 1186.0 | 1083.903 |
| 1185.0 | 1121.115 |
| 1184.0 | 1104.117 |
| 1183.0 | 1037.938 |
| 1182.0 | 1067.058 |
| 1181.0 | 1064.089 |
| 1180.0 | 1075.481 |
| 1179.0 | 1060.678 |
| 1178.0 | 1033.727 |
| 1177.0 | 1078.294 |
| 1176.0 | 1009.694 |
| 1175.0 | 1054.755 |
| 1174.0 | 1052.594 |
| 1173.0 | 1023.097 |
| 1172.0 | 1042.476 |
| 1171.0 | 1035.263 |
| 1170.0 | 1020.547 |
| 1169.0 | 1054.667 |
| 1168.0 | 1044.154 |
| 1167.0 | 1028.182 |
| 1166.0 | 1036.178 |
| 1165.0 | 1038.974 |
| 1164.0 | 1036.252 |
| 1163.0 | 1028.637 |
| 1162.0 | 1053.301 |
| 1161.0 | 1063.362 |
| 1160.0 | 1066.965 |
| 1159.0 | 1056.279 |
| 1158.0 | 1074.58 |
| 1157.0 | 1095.985 |
| 1156.0 | 1070.331 |
| 1155.0 | 1122.387 |
| 1154.0 | 1089.961 |
| 1153.0 | 1113.203 |
| 1152.0 | 1107.787 |
| 1151.0 | 1117.446 |
| 1150.0 | 1133.181 |
| 1149.0 | 1142.054 |
| 1148.0 | 1165.828 |
| 1147.0 | 1174.136 |
| 1146.0 | 1195.461 |
| 1145.0 | 1172.216 |
| 1144.0 | 1174.499 |
| 1143.0 | 1212.856 |
| 1142.0 | 1254.411 |
| 1141.0 | 1207.991 |
| 1140.0 | 1265.998 |
| 1139.0 | 1245.05 |
| 1138.0 | 1278.001 |
| 1137.0 | 1313.673 |
| 1136.0 | 1274.961 |
| 1135.0 | 1301.419 |
| 1134.0 | 1306.045 |
| 1133.0 | 1338.024 |
| 1132.0 | 1309.98 |
| 1131.0 | 1330.228 |
| 1130.0 | 1403.743 |
| 1129.0 | 1401.626 |
| 1128.0 | 1351.588 |
| 1127.0 | 1455.901 |
| 1126.0 | 1457.377 |
| 1125.0 | 1419.426 |
| 1124.0 | 1462.165 |
| 1123.0 | 1402.232 |
| 1122.0 | 1449.728 |
| 1121.0 | 1436.234 |
| 1120.0 | 1433.298 |
| 1119.0 | 1425.498 |
| 1118.0 | 1444.191 |
| 1117.0 | 1464.68 |
| 1116.0 | 1385.524 |
| 1115.0 | 1416.484 |
| 1114.0 | 1493.744 |
| 1113.0 | 1490.08 |
| 1112.0 | 1516.869 |
| 1111.0 | 1460.256 |
| 1110.0 | 1541.691 |
| 1109.0 | 1451.337 |
| 1108.0 | 1467.434 |
| 1107.0 | 1461.183 |
| 1106.0 | 1513.221 |
| 1105.0 | 1444.462 |
| 1104.0 | 1470.001 |
| 1103.0 | 1460.853 |
| 1102.0 | 1519.332 |
| 1101.0 | 1552.994 |
| 1100.0 | 1472.788 |
| 1099.0 | 1462.469 |
| 1098.0 | 1478.616 |
| 1097.0 | 1464.723 |
| 1096.0 | 1461.77 |
| 1095.0 | 1472.134 |
| 1094.0 | 1498.943 |
| 1093.0 | 1481.744 |
| 1092.0 | 1505.424 |
| 1091.0 | 1467.614 |
| 1090.0 | 1430.398 |
| 1089.0 | 1485.962 |
| 1088.0 | 1473.421 |
| 1087.0 | 1432.374 |
| 1086.0 | 1432.707 |
| 1085.0 | 1425.96 |
| 1084.0 | 1449.725 |
| 1083.0 | 1395.906 |
| 1082.0 | 1428.651 |
| 1081.0 | 1402.213 |
| 1080.0 | 1427.464 |
| 1079.0 | 1375.227 |
| 1078.0 | 1379.323 |
| 1077.0 | 1356.121 |
| 1076.0 | 1340.017 |
| 1075.0 | 1328.007 |
| 1074.0 | 1355.793 |
| 1073.0 | 1301.691 |
| 1072.0 | 1312.712 |
| 1071.0 | 1350.18 |
| 1070.0 | 1291.209 |
| 1069.0 | 1293.166 |
| 1068.0 | 1221.006 |
| 1067.0 | 1272.865 |
| 1066.0 | 1224.668 |
| 1065.0 | 1213.121 |
| 1064.0 | 1183.917 |
| 1063.0 | 1210.41 |
| 1062.0 | 1194.274 |
| 1061.0 | 1162.299 |
| 1060.0 | 1134.064 |
| 1059.0 | 1123.586 |
| 1058.0 | 1122.929 |
| 1057.0 | 1071.226 |
| 1056.0 | 1073.274 |
| 1055.0 | 1042.14 |
| 1054.0 | 1078.561 |
| 1053.0 | 1082.906 |
| 1052.0 | 1060.681 |
| 1051.0 | 1043.78 |
| 1050.0 | 1035.301 |
| 1049.0 | 1056.459 |
| 1048.0 | 1061.106 |
| 1047.0 | 1055.723 |
| 1046.0 | 1056.842 |
| 1045.0 | 1058.009 |
| 1044.0 | 1061.481 |
| 1043.0 | 1065.985 |
| 1042.0 | 1065.954 |
| 1041.0 | 1033.621 |
| 1040.0 | 1038.915 |
| 1039.0 | 1042.396 |
| 1038.0 | 1050.739 |
| 1037.0 | 1061.759 |
| 1036.0 | 1061.226 |
| 1035.0 | 1070.542 |
| 1034.0 | 1038.886 |
| 1033.0 | 1048.969 |
| 1032.0 | 1057.091 |
| 1031.0 | 1066.819 |
| 1030.0 | 1075.204 |
| 1029.0 | 1044.583 |
| 1028.0 | 1057.001 |
| 1027.0 | 1062.874 |
| 1026.0 | 1070.683 |
| 1025.0 | 1040.211 |
| 1024.0 | 1050.13 |
| 1023.0 | 1059.029 |
| 1022.0 | 1067.425 |
| 1021.0 | 1076.979 |
| 1020.0 | 1090.429 |
| 1019.0 | 1097.789 |
| 1018.0 | 1105.265 |
| 1017.0 | 1115.832 |
| 1016.0 | 1128.83 |
| 1015.0 | 1131.568 |
| 1014.0 | 1132.034 |
| 1013.0 | 1146.206 |
| 1012.0 | 1156.082 |
| 1011.0 | 1154.896 |
| 1010.0 | 1162.21 |
| 1009.0 | 1164.112 |
| 1008.0 | 1167.625 |
| 1007.0 | 1172.513 |
| 1006.0 | 1180.155 |
| 1005.0 | 1183.683 |
| 1004.0 | 1183.157 |
| 1003.0 | 1182.348 |
| 1002.0 | 1182.318 |
| 1001.0 | 1189.174 |
| 1000.0 | 1181.74 |
| 999.0 | 1182.502 |
| 998.0 | 1175.699 |
| 997.0 | 1177.461 |
| 996.0 | 1177.935 |
| 995.0 | 1177.907 |
| 994.0 | 1171.801 |
| 993.0 | 1168.494 |
| 992.0 | 1159.651 |
| 991.0 | 1155.244 |
| 990.0 | 1149.669 |
| 989.0 | 1143.602 |
| 988.0 | 1133.679 |
| 987.0 | 1133.236 |
| 986.0 | 1126.53 |
| 985.0 | 1113.736 |
| 984.0 | 1108.43 |
| 983.0 | 1103.777 |
| 982.0 | 1092.82 |
| 981.0 | 1088.069 |
| 980.0 | 1082.757 |
| 979.0 | 1077.138 |
| 978.0 | 1073.739 |
| 977.0 | 1063.126 |
| 976.0 | 1060.318 |
| 975.0 | 1051.208 |
| 974.0 | 1047.978 |
| 973.0 | 1046.07 |
| 972.0 | 1042.958 |
| 971.0 | 1038.176 |
| 970.0 | 1038.156 |
| 969.0 | 1074.038 |
| 968.0 | 1074.972 |
| 967.0 | 1039.084 |
| 966.0 | 1075.317 |
| 965.0 | 1076.923 |
| 964.0 | 1074.232 |
| 963.0 | 1038.045 |
| 962.0 | 1043.291 |
| 961.0 | 1043.114 |
| 960.0 | 1041.558 |
| 959.0 | 1045.727 |
| 958.0 | 1049.85 |
| 957.0 | 1052.724 |
| 956.0 | 1054.213 |
| 955.0 | 1058.071 |
| 954.0 | 1065.632 |
| 953.0 | 1063.596 |
| 952.0 | 1068.508 |
| 951.0 | 1067.043 |
| 950.0 | 1076.552 |
| 949.0 | 1080.387 |
| 948.0 | 1083.309 |
| 947.0 | 1081.952 |
| 946.0 | 1089.026 |
| 945.0 | 1093.64 |
| 944.0 | 1098.954 |
| 943.0 | 1097.35 |
| 942.0 | 1098.985 |
| 941.0 | 1100.28 |
| 940.0 | 1109.311 |
| 939.0 | 1110.166 |
| 938.0 | 1118.325 |
| 937.0 | 1119.649 |
| 936.0 | 1122.081 |
| 935.0 | 1125.266 |
| 934.0 | 1131.967 |
| 933.0 | 1132.85 |
| 932.0 | 1137.272 |
| 931.0 | 1127.345 |
| 930.0 | 1133.851 |
| 929.0 | 1142.927 |
| 928.0 | 1136.603 |
| 927.0 | 1148.221 |
| 926.0 | 1150.257 |
| 925.0 | 1154.21 |
| 924.0 | 1161.321 |
| 923.0 | 1155.697 |
| 922.0 | 1164.946 |
| 921.0 | 1164.597 |
| 920.0 | 1166.69 |
| 919.0 | 1158.595 |
| 918.0 | 1167.006 |
| 917.0 | 1171.102 |
| 916.0 | 1166.497 |
| 915.0 | 1161.128 |
| 914.0 | 1168.616 |
| 913.0 | 1165.282 |
| 912.0 | 1154.921 |
| 911.0 | 1168.9 |
| 910.0 | 1141.722 |
| 909.0 | 1144.386 |
| 908.0 | 1148.873 |
| 907.0 | 1151.502 |
| 906.0 | 1162.161 |
| 905.0 | 1151.911 |
| 904.0 | 1150.871 |
| 903.0 | 1128.529 |
| 902.0 | 1128.955 |
| 901.0 | 1130.857 |
| 900.0 | 1126.293 |
| 899.0 | 1112.496 |
| 898.0 | 1112.064 |
| 897.0 | 1101.298 |
| 896.0 | 1102.331 |
| 895.0 | 1095.405 |
| 894.0 | 1086.002 |
| 893.0 | 1054.47 |
| 892.0 | 1057.942 |
| 891.0 | 1057.688 |
| 890.0 | 1049.915 |
| 889.0 | 1045.137 |
| 888.0 | 1069.894 |
| 887.0 | 1073.758 |
| 886.0 | 1054.893 |
| 885.0 | 1048.956 |
| 884.0 | 1056.347 |
| 883.0 | 1054.459 |
| 882.0 | 1060.686 |
| 881.0 | 1060.047 |
| 880.0 | 1068.003 |
| 879.0 | 1044.819 |
| 878.0 | 1047.747 |
| 877.0 | 1043.672 |
| 876.0 | 1045.748 |
| 875.0 | 1053.935 |
| 874.0 | 1054.712 |
| 873.0 | 1040.53 |
| 872.0 | 1036.537 |
| 871.0 | 1045.927 |
| 870.0 | 1049.567 |
| 869.0 | 1061.835 |
| 868.0 | 1045.636 |
| 867.0 | 1045.318 |
| 866.0 | 1061.733 |
| 865.0 | 1025.708 |
| 864.0 | 1049.605 |
| 863.0 | 1039.6 |
| 862.0 | 1024.943 |
| 861.0 | 1033.585 |
| 860.0 | 1033.617 |
| 859.0 | 1032.027 |
| 858.0 | 1039.846 |
| 857.0 | 1050.827 |
| 856.0 | 1035.535 |
| 855.0 | 1046.137 |
| 854.0 | 1040.164 |
| 853.0 | 1059.074 |
| 852.0 | 1029.428 |
| 851.0 | 1055.411 |
| 850.0 | 1048.829 |
| 849.0 | 1050.62 |
| 848.0 | 1042.263 |
| 847.0 | 1020.169 |
| 846.0 | 1051.891 |
| 845.0 | 1026.316 |
| 844.0 | 1041.214 |
| 843.0 | 1027.89 |
| 842.0 | 1039.118 |
| 841.0 | 1044.471 |
| 840.0 | 1052.052 |
| 839.0 | 1028.628 |
| 838.0 | 1026.579 |
| 837.0 | 1028.914 |
| 836.0 | 1037.92 |
| 835.0 | 1040.33 |
| 834.0 | 1037.385 |
| 833.0 | 1018.891 |
| 832.0 | 1025.583 |
| 831.0 | 1035.369 |
| 830.0 | 1027.045 |
| 829.0 | 1012.222 |
| 828.0 | 1019.587 |
| 827.0 | 1030.394 |
| 826.0 | 1040.619 |
| 825.0 | 1038.514 |
| 824.0 | 1035.821 |
| 823.0 | 1022.846 |
| 822.0 | 1039.795 |
| 821.0 | 1008.78 |
| 820.0 | 1023.883 |
| 819.0 | 1020.066 |
| 818.0 | 1010.444 |
| 817.0 | 1039.026 |
| 816.0 | 1045.573 |
| 815.0 | 1038.001 |
| 814.0 | 1031.599 |
| 813.0 | 1008.661 |
| 812.0 | 1041.616 |
| 811.0 | 1005.876 |
| 810.0 | 1043.179 |
| 809.0 | 1025.807 |
| 808.0 | 1006.165 |
| 807.0 | 1005.313 |
| 806.0 | 1006.023 |
| 805.0 | 1022.911 |
| 804.0 | 1035.411 |
| 803.0 | 1059.973 |
| 802.0 | 1034.628 |
| 801.0 | 1042.279 |
| 800.0 | 1046.3 |
| 799.0 | 1028.24 |
| 798.0 | 1026.632 |
| 797.0 | 1027.508 |
| 796.0 | 1008.733 |
| 795.0 | 1008.138 |
| 794.0 | 1015.709 |
| 793.0 | 1089.171 |
| 792.0 | 1023.181 |
| 791.0 | 1032.778 |
| 790.0 | 1027.361 |
| 789.0 | 1007.661 |
| 788.0 | 1016.941 |
| 787.0 | 1023.523 |
| 786.0 | 1039.396 |
| 785.0 | 1019.547 |
| 784.0 | 1019.011 |
| 783.0 | 1006.37 |
| 782.0 | 1043.352 |
| 781.0 | 1032.039 |
| 780.0 | 1001.175 |
| 779.0 | 1019.294 |
| 778.0 | 1038.902 |
| 777.0 | 1019.698 |
| 776.0 | 1040.674 |
| 775.0 | 1030.162 |
| 774.0 | 1023.804 |
| 773.0 | 1005.918 |
| 772.0 | 1013.284 |
| 771.0 | 1042.088 |
| 770.0 | 1012.561 |
| 769.0 | 1039.545 |
| 768.0 | 1034.204 |
| 767.0 | 1041.67 |
| 766.0 | 1038.356 |
| 765.0 | 1025.524 |
| 764.0 | 1024.058 |
| 763.0 | 1030.998 |
| 762.0 | 1023.685 |
| 761.0 | 1019.378 |
| 760.0 | 1010.918 |
| 759.0 | 1043.792 |
| 758.0 | 1041.837 |
| 757.0 | 1020.722 |
| 756.0 | 1022.943 |
| 755.0 | 1025.298 |
| 754.0 | 1027.008 |
| 753.0 | 1041.99 |
| 752.0 | 1029.661 |
| 751.0 | 1023.506 |
| 750.0 | 1035.343 |
| 749.0 | 1056.013 |
| 748.0 | 1067.573 |
| 747.0 | 1041.153 |
| 746.0 | 1067.579 |
| 745.0 | 1056.693 |
| 744.0 | 1051.743 |
| 743.0 | 1076.413 |
| 742.0 | 1030.937 |
| 741.0 | 1110.85 |
| 740.0 | 1054.12 |
| 739.0 | 1045.234 |
| 738.0 | 1068.744 |
| 737.0 | 1073.682 |
| 736.0 | 1038.135 |
| 735.0 | 1060.408 |
| 734.0 | 1107.656 |
| 733.0 | 1055.519 |
| 732.0 | 1095.178 |
| 731.0 | 1164.174 |
| 730.0 | 1107.592 |
| 729.0 | 1085.331 |
| 728.0 | 1106.907 |
| 727.0 | 1052.579 |
| 726.0 | 1051.312 |
| 725.0 | 1135.402 |
| 724.0 | 1084.49 |
| 723.0 | 1058.986 |
| 722.0 | 1086.877 |
| 721.0 | 1048.62 |
| 720.0 | 1125.065 |
| 719.0 | 1084.893 |
| 718.0 | 1145.842 |
| 717.0 | 1346.414 |
| 716.0 | 1078.547 |
| 715.0 | 1059.737 |
| 714.0 | 1066.644 |
| 713.0 | 1059.656 |
| 712.0 | 1066.553 |
| 711.0 | 1082.863 |
| 710.0 | 1051.74 |
| 709.0 | 1073.601 |
| 708.0 | 1057.645 |
| 707.0 | 1071.067 |
| 706.0 | 1072.905 |
| 705.0 | 1044.739 |
| 704.0 | 1045.763 |
| 703.0 | 1055.112 |
| 702.0 | 1081.222 |
| 701.0 | 1065.755 |
| 700.0 | 1070.582 |
| 699.0 | 924.683 |
| 698.0 | 918.792 |
| 697.0 | 778.297 |
| 696.0 | 729.421 |
| 695.0 | 600.303 |
| 694.0 | 565.547 |
| 693.0 | 525.747 |
| 692.0 | 472.27 |
| 691.0 | 427.275 |
| 690.0 | 364.953 |
| 689.0 | 311.159 |
| 688.0 | 281.971 |
| 687.0 | 250.571 |
| 686.0 | 223.532 |
| 685.0 | 199.004 |
| 684.0 | 187.943 |
| 683.0 | 178.269 |
| 682.0 | 167.588 |
| 681.0 | 152.276 |
| 680.0 | 139.847 |
| 679.0 | 134.999 |
| 678.0 | 126.519 |
| 677.0 | 113.744 |
| 676.0 | 104.35 |
| 675.0 | 75.955 |
| 674.0 | 70.256 |
| 673.0 | 67.63 |
| 672.0 | 60.769 |
| 671.0 | 56.769 |
| 670.0 | 54.656 |
| 669.0 | 50.297 |
| 668.0 | 46.973 |
| 667.0 | 44.661 |
| 666.0 | 41.956 |
| 665.0 | 39.909 |
| 664.0 | 38.105 |
| 663.0 | 36.448 |
| 662.0 | 35.139 |
| 661.0 | 34.131 |
| 660.0 | 33.014 |
| 659.0 | 32.092 |
| 658.0 | 31.302 |
| 657.0 | 30.457 |
| 656.0 | 29.975 |
| 655.0 | 29.426 |
| 654.0 | 28.908 |
| 653.0 | 28.379 |
| 652.0 | 27.849 |
| 651.0 | 27.214 |
| 650.0 | 26.465 |
| 649.0 | 25.826 |
| 648.0 | 25.183 |
| 647.0 | 24.237 |
| 646.0 | 23.464 |
| 645.0 | 22.276 |
| 644.0 | 21.288 |
| 643.0 | 20.085 |
| 642.0 | 18.817 |
| 641.0 | 17.516 |
| 640.0 | 16.21 |
| 639.0 | 14.762 |
| 638.0 | 13.375 |
| 637.0 | 12.04 |
| 636.0 | 10.722 |
| 635.0 | 9.565 |
| 634.0 | 8.482 |
| 633.0 | 7.521 |
| 632.0 | 6.695 |
| 631.0 | 5.986 |
| 630.0 | 5.381 |
| 629.0 | 4.882 |
| 628.0 | 4.466 |
| 627.0 | 4.115 |
| 626.0 | 3.829 |
| 625.0 | 3.589 |
| 624.0 | 3.388 |
| 623.0 | 3.221 |
| 622.0 | 3.081 |
| 621.0 | 2.964 |
| 620.0 | 2.868 |
| 619.0 | 2.789 |
| 618.0 | 2.72 |
| 617.0 | 2.663 |
| 616.0 | 2.617 |
| 615.0 | 2.58 |
| 614.0 | 2.551 |
| 613.0 | 2.526 |
| 612.0 | 2.511 |
| 611.0 | 2.5 |
| 610.0 | 2.494 |
| 609.0 | 2.494 |
| 608.0 | 2.498 |
| 607.0 | 2.508 |
| 606.0 | 2.522 |
| 605.0 | 2.541 |
| 604.0 | 2.564 |
| 603.0 | 2.591 |
| 602.0 | 2.623 |
| 601.0 | 2.656 |
| 600.0 | 2.696 |
| 599.0 | 2.741 |
| 598.0 | 2.791 |
| 597.0 | 2.847 |
| 596.0 | 2.913 |
| 595.0 | 2.981 |
| 594.0 | 3.055 |
| 593.0 | 3.137 |
| 592.0 | 3.214 |
| 591.0 | 3.303 |
| 590.0 | 3.397 |
| 589.0 | 3.507 |
| 588.0 | 3.623 |
| 587.0 | 3.75 |
| 586.0 | 3.903 |
| 585.0 | 4.081 |
| 584.0 | 4.295 |
| 583.0 | 4.541 |
| 582.0 | 4.836 |
| 581.0 | 5.187 |
| 580.0 | 5.587 |
| 579.0 | 6.026 |
| 578.0 | 6.472 |
| 577.0 | 6.874 |
| 576.0 | 7.172 |
| 575.0 | 7.353 |
| 574.0 | 7.396 |
| 573.0 | 7.223 |
| 572.0 | 6.928 |
| 571.0 | 6.494 |
| 570.0 | 5.985 |
| 569.0 | 5.487 |
| 568.0 | 5.055 |
| 567.0 | 4.709 |
| 566.0 | 4.456 |
| 565.0 | 4.273 |
| 564.0 | 4.153 |
| 563.0 | 4.078 |
| 562.0 | 4.028 |
| 561.0 | 3.994 |
| 560.0 | 3.968 |
| 559.0 | 3.96 |
| 558.0 | 3.964 |
| 557.0 | 3.963 |
| 556.0 | 3.973 |
| 555.0 | 3.988 |
| 554.0 | 4.026 |
| 553.0 | 4.071 |
| 552.0 | 4.107 |
| 551.0 | 4.163 |
| 550.0 | 4.227 |
| 549.0 | 4.275 |
| 548.0 | 4.315 |
| 547.0 | 4.343 |
| 546.0 | 4.338 |
| 545.0 | 4.287 |
| 544.0 | 4.192 |
| 543.0 | 4.034 |
| 542.0 | 3.854 |
| 541.0 | 3.659 |
| 540.0 | 3.456 |
| 539.0 | 3.294 |
| 538.0 | 3.171 |
| 537.0 | 3.089 |
| 536.0 | 3.07 |
| 535.0 | 3.073 |
| 534.0 | 3.125 |
| 533.0 | 3.205 |
| 532.0 | 3.312 |
| 531.0 | 3.411 |
| 530.0 | 3.504 |
| 529.0 | 3.578 |
| 528.0 | 3.618 |
| 527.0 | 3.636 |
| 526.0 | 3.648 |
| 525.0 | 3.677 |
| 524.0 | 3.707 |
| 523.0 | 3.764 |
| 522.0 | 3.822 |
| 521.0 | 3.899 |
| 520.0 | 3.953 |
| 519.0 | 3.962 |
| 518.0 | 3.963 |
| 517.0 | 3.911 |
| 516.0 | 3.823 |
| 515.0 | 3.725 |
| 514.0 | 3.599 |
| 513.0 | 3.489 |
| 512.0 | 3.369 |
| 511.0 | 3.276 |
| 510.0 | 3.199 |
| 509.0 | 3.133 |
| 508.0 | 3.068 |
| 507.0 | 3.021 |
| 506.0 | 2.976 |
| 505.0 | 2.931 |
| 504.0 | 2.88 |
| 503.0 | 2.818 |
| 502.0 | 2.74 |
| 501.0 | 2.673 |
| 500.0 | 2.591 |
| 499.0 | 2.533 |
| 498.0 | 2.492 |
| 497.0 | 2.459 |
| 496.0 | 2.449 |
| 495.0 | 2.446 |
| 494.0 | 2.461 |
| 493.0 | 2.486 |
| 492.0 | 2.517 |
| 491.0 | 2.551 |
| 490.0 | 2.594 |
| 489.0 | 2.634 |
| 488.0 | 2.666 |
| 487.0 | 2.711 |
| 486.0 | 2.735 |
| 485.0 | 2.749 |
| 484.0 | 2.768 |
| 483.0 | 2.767 |
| 482.0 | 2.764 |
| 481.0 | 2.761 |
| 480.0 | 2.749 |
| 479.0 | 2.743 |
| 478.0 | 2.738 |
| 477.0 | 2.74 |
| 476.0 | 2.752 |
| 475.0 | 2.763 |
| 474.0 | 2.776 |
| 473.0 | 2.768 |
| 472.0 | 2.762 |
| 471.0 | 2.723 |
| 470.0 | 2.661 |
| 469.0 | 2.594 |
| 468.0 | 2.53 |
| 467.0 | 2.475 |
| 466.0 | 2.444 |
| 465.0 | 2.436 |
| 464.0 | 2.445 |
| 463.0 | 2.478 |
| 462.0 | 2.532 |
| 461.0 | 2.605 |
| 460.0 | 2.675 |
| 459.0 | 2.762 |
| 458.0 | 2.863 |
| 457.0 | 2.978 |
| 456.0 | 3.096 |
| 455.0 | 3.25 |
| 454.0 | 3.404 |
| 453.0 | 3.602 |
| 452.0 | 3.863 |
| 451.0 | 4.162 |
| 450.0 | 4.591 |
| 449.0 | 5.076 |
| 448.0 | 5.593 |
| 447.0 | 6.151 |
| 446.0 | 6.651 |
| 445.0 | 7.063 |
| 444.0 | 7.477 |
| 443.0 | 7.877 |
| 442.0 | 8.472 |
| 441.0 | 8.987 |
| 440.0 | 9.788 |
| 439.0 | 10.933 |
| 438.0 | 12.273 |
| 437.0 | 14.228 |
| 436.0 | 16.497 |
| 435.0 | 19.179 |
| 434.0 | 21.125 |
| 433.0 | 22.67 |
| 432.0 | 24.692 |
| 431.0 | 26.534 |
| 430.0 | 26.503 |
| 429.0 | 27.812 |
| 428.0 | 28.617 |
| 427.0 | 30.329 |
| 426.0 | 31.989 |
| 425.0 | 33.9 |
| 424.0 | 34.331 |
| 423.0 | 40.473 |
| 422.0 | 42.476 |
| 421.0 | 46.335 |
| 420.0 | 52.588 |
| 419.0 | 64.211 |
| 418.0 | 72.906 |
| 417.0 | 73.529 |
| 416.0 | 78.634 |
| 415.0 | 85.019 |
| 414.0 | 89.284 |
| 413.0 | 83.601 |
| 412.0 | 116.149 |
| 411.0 | 96.596 |
| 410.0 | 92.41 |
| 409.0 | 82.121 |
| 408.0 | 105.128 |
| 407.0 | 101.35 |
| 406.0 | 97.833 |
| 405.0 | 254.028 |
| 404.0 | 259.43 |
| 403.0 | 100.725 |
| 402.0 | 102.344 |
| 401.0 | 68.917 |
| 400.0 | 221.375 |
| 399.0 | 242.837 |
| 398.0 | 79.167 |
| 397.0 | 57.675 |
| 396.0 | 69.207 |
| 395.0 | 39.219 |
| 394.0 | 26.253 |
| 393.0 | 20.082 |
| 392.0 | 13.619 |
| 391.0 | 13.08 |
| 390.0 | 12.348 |
| 389.0 | 9.468 |
| 388.0 | 9.486 |
| 387.0 | 8.013 |
| 386.0 | 6.912 |
| 385.0 | 7.356 |
| 384.0 | 6.319 |
| 383.0 | 6.419 |
| 382.0 | 6.036 |
| 381.0 | 5.93 |
| 380.0 | 6.724 |
| 379.0 | 5.764 |
| 378.0 | 4.859 |
| 377.0 | 6.134 |
| 376.0 | 6.137 |
| 375.0 | 4.566 |
| 374.0 | 3.659 |
| 373.0 | 2.766 |
| 372.0 | 8.587 |
| 371.0 | 13.101 |
| 370.0 | 5.32 |
| 369.0 | 1.023 |
| 368.0 | 0.781 |
| 367.0 | 1.051 |
| 366.0 | 1.941 |
| 365.0 | 1.58 |
| 364.0 | 0.58 |
| 363.0 | 0.107 |
| 362.0 | 0.162 |
| 361.0 | 0.534 |
| 360.0 | 0.441 |
| 359.0 | 1.24 |
| 358.0 | 9.837 |
| 357.0 | 0.156 |
| 356.0 | 1.422 |
| 355.0 | 0.907 |
| 354.0 | 0.933 |
| 353.0 | 0.356 |
| 352.0 | 1.621 |
| 351.0 | 0.202 |
| 350.0 | 0.011 |
| 349.0 | 0.013 |
| 348.0 | 2.801 |
| 347.0 | 0.015 |
| 346.0 | 3.322 |
| 345.0 | 0.441 |
| 344.0 | 2.671 |
| 343.0 | 0.585 |
| 342.0 | 0.189 |
| 341.0 | 4.374 |
| 340.0 | 2.1 |
| 339.0 | 4.28 |
| 338.0 | 0.326 |
| 337.0 | 1.58 |
| 336.0 | 0.364 |
| 335.0 | 0.686 |
| 334.0 | 0.58 |
| 333.0 | 3.695 |
| 332.0 | 0.232 |
| 331.0 | 0.235 |
| 330.0 | 1.852 |
| 329.0 | 0.07 |
| 328.0 | 0.495 |
| 327.0 | 2.115 |
| 326.0 | 0.879 |
| 325.0 | 0.137 |
| 324.0 | 0.028 |
| 323.0 | 0.716 |
| 322.0 | 0.549 |
| 321.0 | 1.928 |
| 320.0 | 0.735 |
| 319.0 | 5.134 |
| 318.0 | 0.743 |
| 317.0 | 0.621 |
| 316.0 | 0.092 |
| 315.0 | 0.871 |
| 314.0 | 0.323 |
| 313.0 | 1.643 |
| 312.0 | 0.344 |
| 311.0 | 0.591 |
| 310.0 | 1.087 |
| 309.0 | 0.354 |
| 308.0 | 0.287 |
| 307.0 | 0.314 |
| 306.0 | 0.359 |
| 305.0 | 1.188 |
| 304.0 | 1.71 |
| 303.0 | 0.82 |
| 302.0 | 1.098 |
| 301.0 | 0.452 |
| 300.0 | 0.489 |
| 299.0 | 1.272 |
| 298.0 | 0.455 |
| 297.0 | 0.478 |
| 296.0 | 0.744 |
| 295.0 | 0.273 |
| 294.0 | 0.323 |
| 293.0 | 1.255 |
| 292.0 | 0.564 |
| 291.0 | 0.369 |
| 290.0 | 4.103 |
| 289.0 | 3.239 |
| 288.0 | 0.151 |
| 287.0 | 30.498 |
| 286.0 | 1.132 |
| 285.0 | 5.053 |
| 284.0 | 0.129 |
| 283.0 | 4.772 |
| 282.0 | 0.731 |
| 281.0 | 2.231 |
| 280.0 | 1.225 |
| 279.0 | 3.148 |
| 278.0 | 0.058 |
| 277.0 | 8.334 |
| 276.0 | 4.949 |
| 275.0 | 3.968 |
| 274.0 | 0.852 |
| 273.0 | 0.205 |
| 272.0 | 0.41 |
| 271.0 | 2.349 |
| 270.0 | 0.735 |
| 269.0 | 0.794 |
| 268.0 | 2.818 |
| 267.0 | 3.944 |
| 266.0 | 3.056 |
| 265.0 | 6.298 |
| 264.0 | 0.263 |
| 263.0 | 62.998 |
| 262.0 | 1.08 |
| 261.0 | 5.763 |
| 260.0 | 1.782 |
| 259.0 | 0.302 |
| 258.0 | 2.181 |
| 257.0 | 0.11 |
| 256.0 | 0.258 |
| 255.0 | 1.628 |
| 254.0 | 1.311 |
| 253.0 | 5.951 |
| 252.0 | 1.343 |
| 251.0 | 2.288 |
| 250.0 | 1.009 |